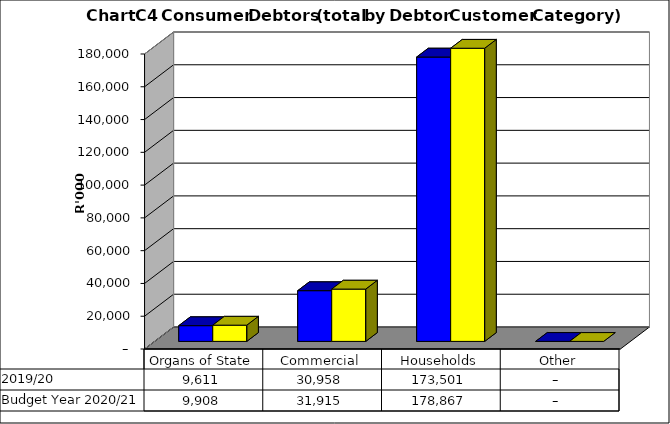
| Category |  2019/20  | Budget Year 2020/21 |
|---|---|---|
| Organs of State | 9610513.019 | 9907745.38 |
| Commercial | 30957949.097 | 31915411.44 |
| Households | 173500542.84 | 178866539.01 |
| Other | 0 | 0 |